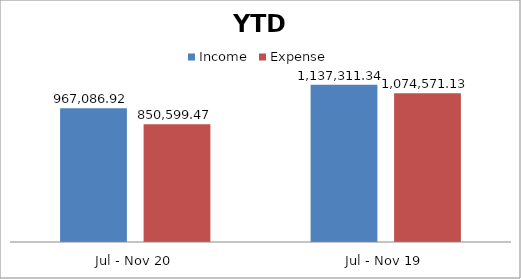
| Category | Income  | Expense |
|---|---|---|
| Jul - Nov 20 | 967086.92 | 850599.47 |
| Jul - Nov 19 | 1137311.34 | 1074571.13 |